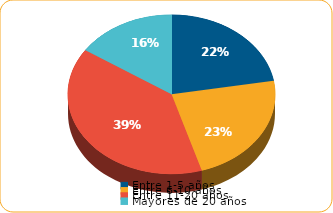
| Category | Series 0 |
|---|---|
| Entre 1-5 años | 3260.1 |
| Entre 6-10 años | 3366.5 |
| Entre 11-20 años | 5716.4 |
| Mayores de 20 años | 2287.3 |